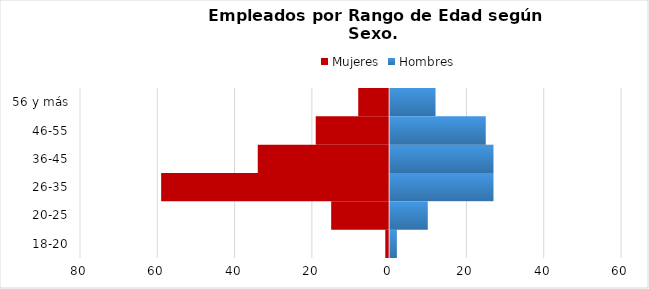
| Category | Mujeres | Hombres |
|---|---|---|
| 18-20 | -1 | 2 |
| 20-25 | -15 | 10 |
| 26-35 | -59 | 27 |
| 36-45 | -34 | 27 |
| 46-55 | -19 | 25 |
| 56 y más | -8 | 12 |